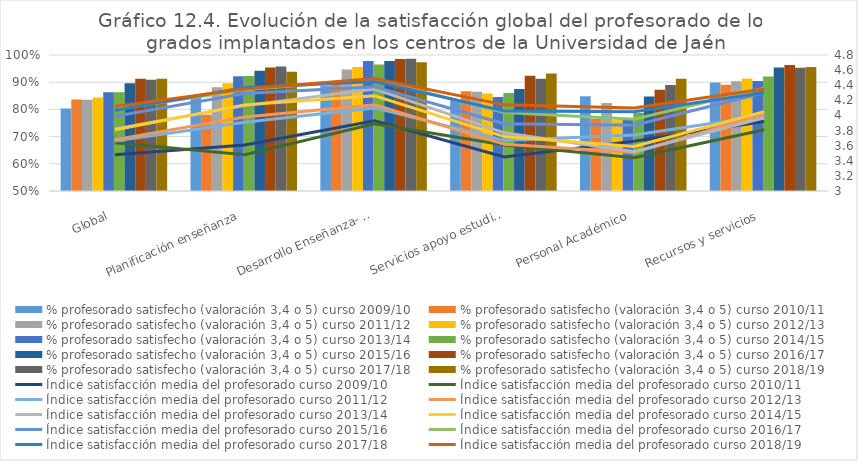
| Category | % profesorado satisfecho (valoración 3,4 o 5) curso 2009/10 | % profesorado satisfecho (valoración 3,4 o 5) curso 2010/11 | % profesorado satisfecho (valoración 3,4 o 5) curso 2011/12 | % profesorado satisfecho (valoración 3,4 o 5) curso 2012/13 | % profesorado satisfecho (valoración 3,4 o 5) curso 2013/14 | % profesorado satisfecho (valoración 3,4 o 5) curso 2014/15 | % profesorado satisfecho (valoración 3,4 o 5) curso 2015/16 | % profesorado satisfecho (valoración 3,4 o 5) curso 2016/17 | % profesorado satisfecho (valoración 3,4 o 5) curso 2017/18 | % profesorado satisfecho (valoración 3,4 o 5) curso 2018/19 |
|---|---|---|---|---|---|---|---|---|---|---|
| Global | 0.803 | 0.837 | 0.836 | 0.844 | 0.863 | 0.863 | 0.896 | 0.913 | 0.909 | 0.913 |
| Planificación enseñanza | 0.848 | 0.781 | 0.882 | 0.896 | 0.922 | 0.922 | 0.942 | 0.954 | 0.958 | 0.939 |
| Desarrollo Enseñanza- evaluación aprendizaje | 0.888 | 0.902 | 0.947 | 0.956 | 0.978 | 0.965 | 0.978 | 0.985 | 0.986 | 0.974 |
| Servicios apoyo estudiante | 0.835 | 0.867 | 0.865 | 0.859 | 0.846 | 0.86 | 0.875 | 0.923 | 0.913 | 0.932 |
| Personal Académico | 0.848 | 0.766 | 0.824 | 0.761 | 0.762 | 0.788 | 0.848 | 0.872 | 0.89 | 0.912 |
| Recursos y servicios | 0.899 | 0.89 | 0.904 | 0.914 | 0.904 | 0.921 | 0.954 | 0.963 | 0.953 | 0.956 |